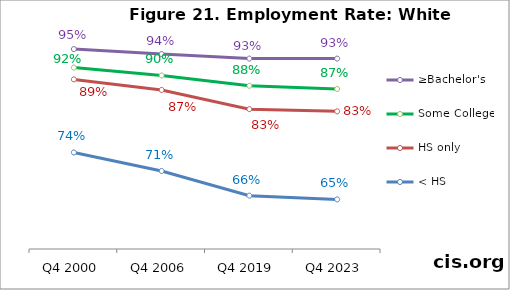
| Category | ≥Bachelor's | Some College | HS only | < HS |
|---|---|---|---|---|
| Q4 2000 | 0.953 | 0.916 | 0.892 | 0.745 |
| Q4 2006 | 0.943 | 0.9 | 0.871 | 0.707 |
| Q4 2019 | 0.934 | 0.879 | 0.832 | 0.658 |
| Q4 2023 | 0.934 | 0.873 | 0.828 | 0.65 |